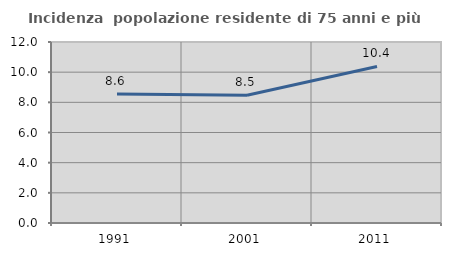
| Category | Incidenza  popolazione residente di 75 anni e più |
|---|---|
| 1991.0 | 8.553 |
| 2001.0 | 8.475 |
| 2011.0 | 10.381 |